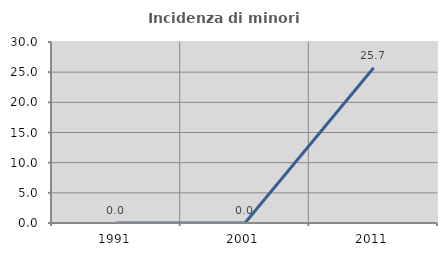
| Category | Incidenza di minori stranieri |
|---|---|
| 1991.0 | 0 |
| 2001.0 | 0 |
| 2011.0 | 25.743 |